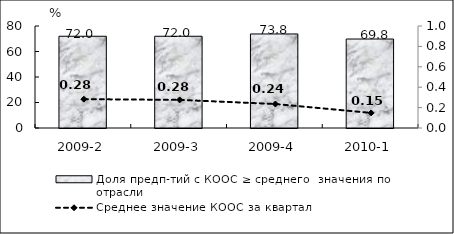
| Category | Доля предп-тий с КООС ≥ среднего  значения по отрасли |
|---|---|
| 2009-2 | 71.95 |
| 2009-3 | 71.95 |
| 2009-4 | 73.76 |
| 2010-1 | 69.79 |